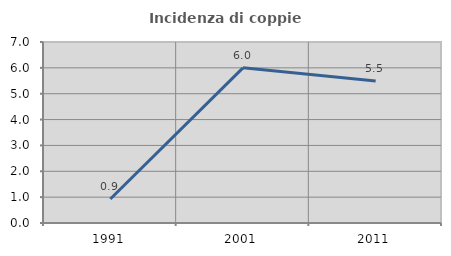
| Category | Incidenza di coppie miste |
|---|---|
| 1991.0 | 0.926 |
| 2001.0 | 6 |
| 2011.0 | 5.495 |